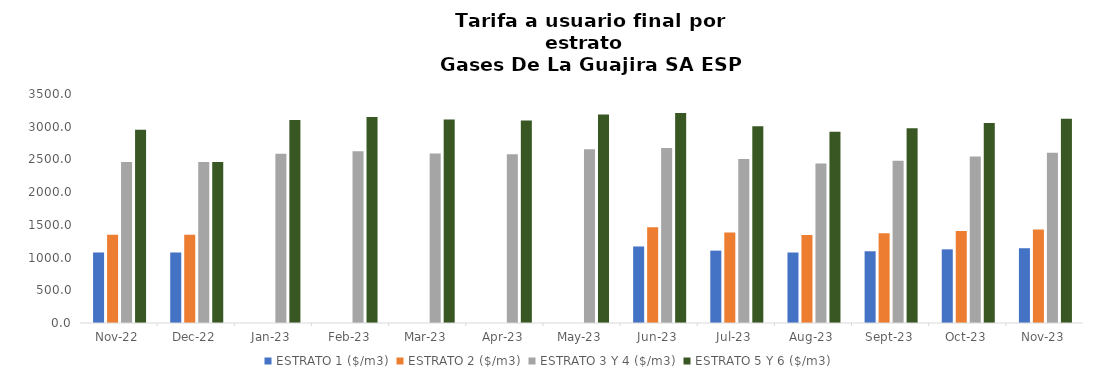
| Category | ESTRATO 1 ($/m3) | ESTRATO 2 ($/m3) | ESTRATO 3 Y 4 ($/m3) | ESTRATO 5 Y 6 ($/m3) |
|---|---|---|---|---|
| 2022-11-01 | 1077.8 | 1346.96 | 2461.97 | 2954.364 |
| 2022-12-01 | 1077.8 | 1346.96 | 2461.97 | 2461.97 |
| 2023-01-01 | 0 | 0 | 2586.67 | 3104.004 |
| 2023-02-01 | 0 | 0 | 2623.2 | 3147.84 |
| 2023-03-01 | 0 | 0 | 2590.74 | 3108.888 |
| 2023-04-01 | 0 | 0 | 2580.05 | 3096.06 |
| 2023-05-01 | 0 | 0 | 2656.89 | 3188.268 |
| 2023-06-01 | 1169.58 | 1461.63 | 2673.91 | 3208.692 |
| 2023-07-01 | 1106 | 1382.28 | 2506.8 | 3008.16 |
| 2023-08-01 | 1077.22 | 1345.91 | 2436.6 | 2923.92 |
| 2023-09-01 | 1096.44 | 1370.32 | 2481.1 | 2977.32 |
| 2023-10-01 | 1125.72 | 1407.25 | 2546.63 | 3055.956 |
| 2023-11-01 | 1142.78 | 1427.17 | 2601.21 | 3121.452 |